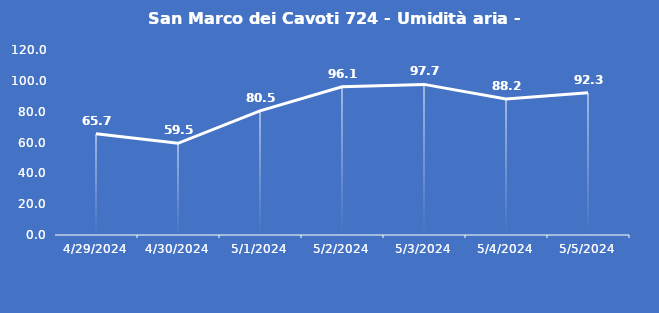
| Category | San Marco dei Cavoti 724 - Umidità aria - Grezzo (%) |
|---|---|
| 4/29/24 | 65.7 |
| 4/30/24 | 59.5 |
| 5/1/24 | 80.5 |
| 5/2/24 | 96.1 |
| 5/3/24 | 97.7 |
| 5/4/24 | 88.2 |
| 5/5/24 | 92.3 |